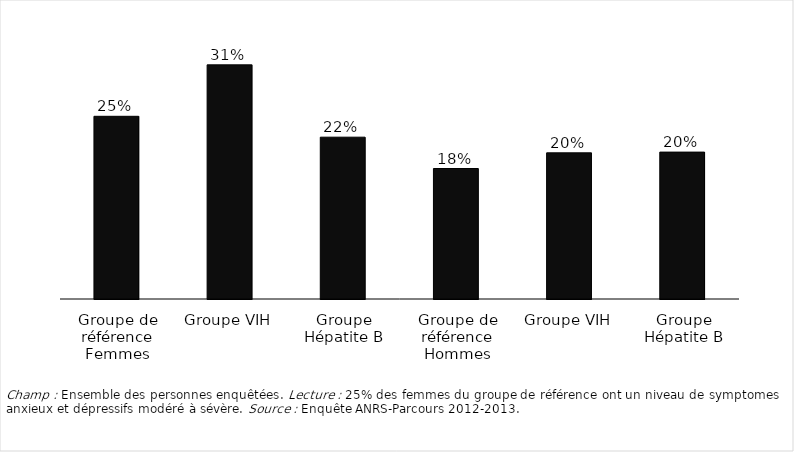
| Category | Niveau modéré à sévère (score au PHQ4 ≥ 6) |
|---|---|
| 0 | 24.5 |
| 1 | 31.4 |
| 2 | 21.7 |
| 3 | 17.5 |
| 4 | 19.6 |
| 5 | 19.7 |